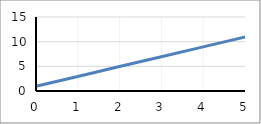
| Category | y |
|---|---|
| 0.0 | 1 |
| 1.0 | 3 |
| 2.0 | 5 |
| 3.0 | 7 |
| 4.0 | 9 |
| 5.0 | 11 |